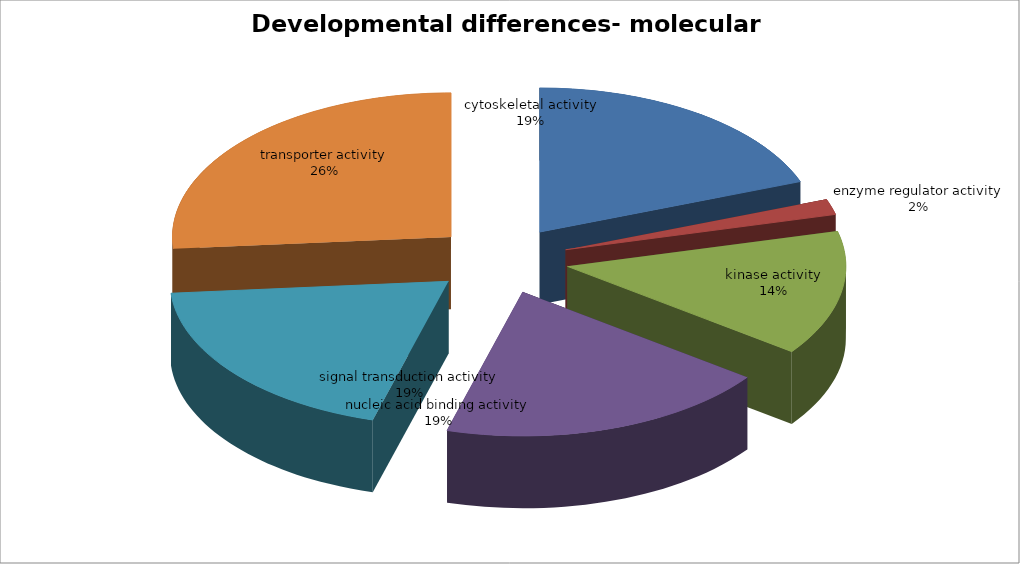
| Category | Series 0 |
|---|---|
| cytoskeletal activity | 11 |
| enzyme regulator activity | 1 |
| kinase activity | 8 |
| nucleic acid binding activity | 11 |
| signal transduction activity | 11 |
| transporter activity | 15 |